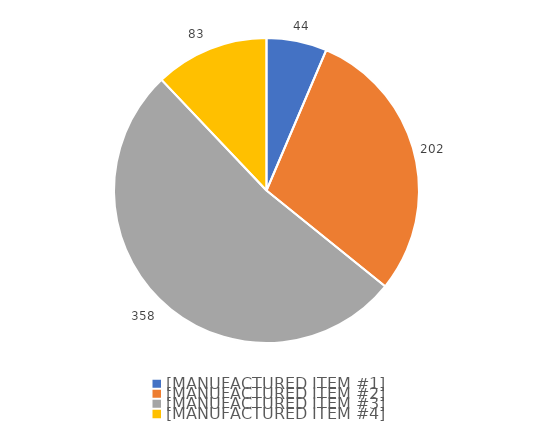
| Category | Series 0 |
|---|---|
| [MANUFACTURED ITEM #1] | 44 |
| [MANUFACTURED ITEM #2] | 202 |
| [MANUFACTURED ITEM #3] | 358 |
| [MANUFACTURED ITEM #4] | 83 |